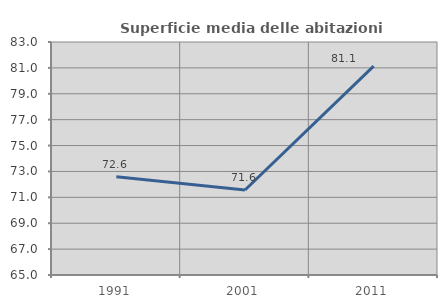
| Category | Superficie media delle abitazioni occupate |
|---|---|
| 1991.0 | 72.584 |
| 2001.0 | 71.563 |
| 2011.0 | 81.141 |